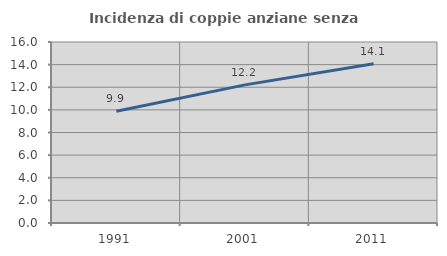
| Category | Incidenza di coppie anziane senza figli  |
|---|---|
| 1991.0 | 9.871 |
| 2001.0 | 12.212 |
| 2011.0 | 14.073 |